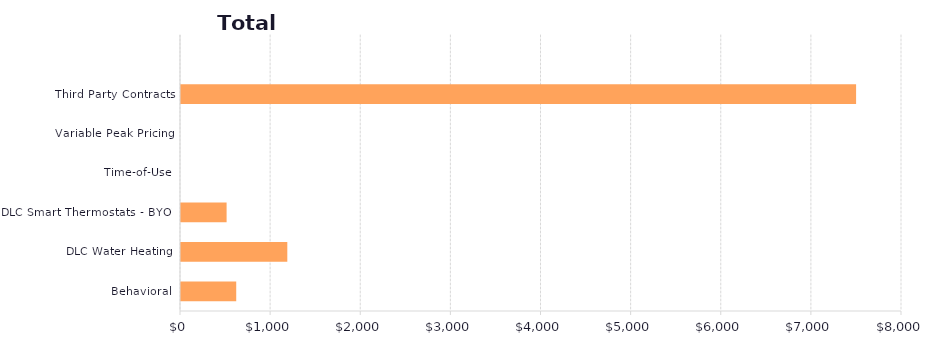
| Category | Series 1 |
|---|---|
| Behavioral | 612.749 |
| DLC Water Heating | 1179.566 |
| DLC Smart Thermostats - BYOT | 506.01 |
| Time-of-Use | 0 |
| Variable Peak Pricing | 0 |
| Third Party Contracts | 7490.637 |